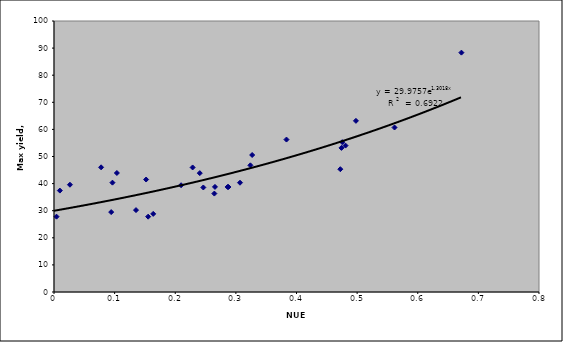
| Category | 100-40-60 |
|---|---|
| 0.00965999999999994 | 37.425 |
| -0.08431799999999995 | 21.84 |
| 0.15529139999999994 | 27.8 |
| 0.32686335000000016 | 50.548 |
| 0.3239411999999999 | 46.736 |
| 0.16364039999999996 | 28.828 |
| 0.24629549999999995 | 38.569 |
| 0.026323500000000024 | 39.582 |
| 0.4754789999999998 | 55.298 |
| 0.26551199999999997 | 38.782 |
| 0.004174500000000023 | 27.8 |
| -0.015456000000000074 | 37.418 |
| 0.09639299999999999 | 40.35 |
| 0.13527449999999994 | 30.22 |
| 0.07765950000000003 | 46.01 |
| 0.15193799999999988 | 41.502 |
| 0.49800749999999994 | 63.16 |
| 0.3068085 | 40.322 |
| 0.240465 | 43.862 |
| 0.09432299999999995 | 29.49 |
| 0.2878317750000001 | 38.747 |
| 0.26449631999999995 | 36.318 |
| 0.47226118500000014 | 45.314 |
| 0.22866619319999998 | 45.956 |
| 0.28633970934 | 38.763 |
| 0.47416681872000005 | 53.168 |
| 0.38347530113999995 | 56.252 |
| 0.48082752948000007 | 54.027 |
| 0.20962506360000005 | 39.397 |
| -0.08773790910000002 | 21.164 |
| 0.10373347391999985 | 43.916 |
| 0.6719926822199999 | 88.329 |
| 0.5616600000000002 | 60.7 |